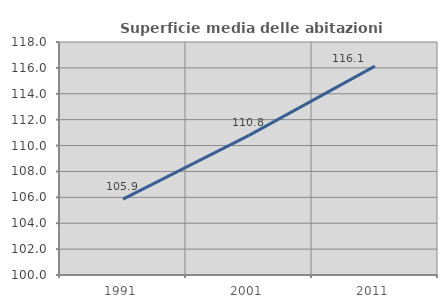
| Category | Superficie media delle abitazioni occupate |
|---|---|
| 1991.0 | 105.86 |
| 2001.0 | 110.79 |
| 2011.0 | 116.136 |